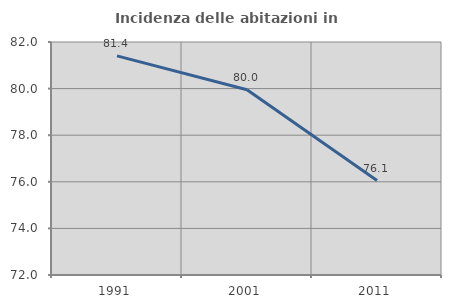
| Category | Incidenza delle abitazioni in proprietà  |
|---|---|
| 1991.0 | 81.403 |
| 2001.0 | 79.952 |
| 2011.0 | 76.052 |